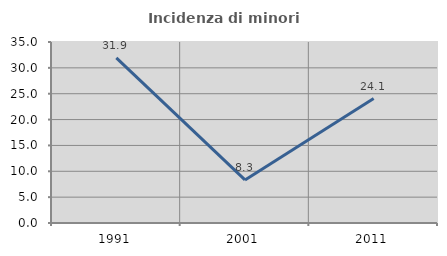
| Category | Incidenza di minori stranieri |
|---|---|
| 1991.0 | 31.915 |
| 2001.0 | 8.333 |
| 2011.0 | 24.054 |